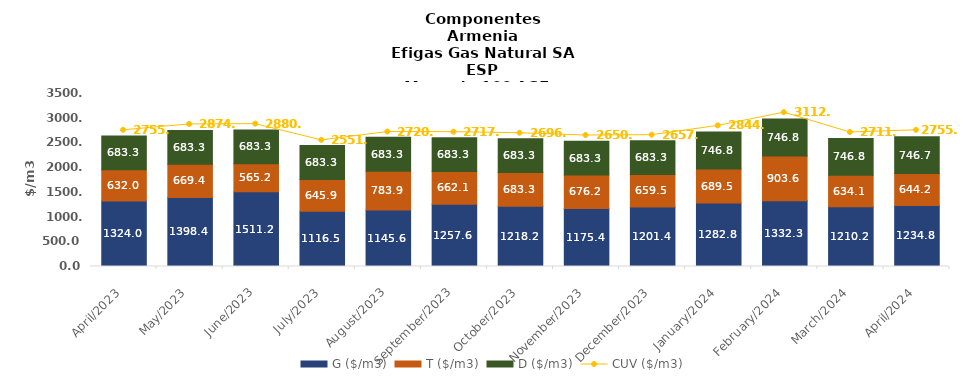
| Category | G ($/m3) | T ($/m3) | D ($/m3) |
|---|---|---|---|
| 2023-04-01 | 1324.021 | 631.998 | 683.343 |
| 2023-05-01 | 1398.419 | 669.403 | 683.343 |
| 2023-06-01 | 1511.242 | 565.219 | 683.343 |
| 2023-07-01 | 1116.463 | 645.939 | 683.343 |
| 2023-08-01 | 1145.565 | 783.894 | 683.343 |
| 2023-09-01 | 1257.568 | 662.12 | 683.343 |
| 2023-10-01 | 1218.237 | 683.343 | 683.34 |
| 2023-11-01 | 1175.364 | 676.175 | 683.343 |
| 2023-12-01 | 1201.409 | 659.456 | 683.343 |
| 2024-01-01 | 1282.796 | 689.52 | 746.758 |
| 2024-02-01 | 1332.332 | 903.58 | 746.758 |
| 2024-03-01 | 1210.189 | 634.069 | 746.758 |
| 2024-04-01 | 1234.849 | 644.206 | 746.723 |